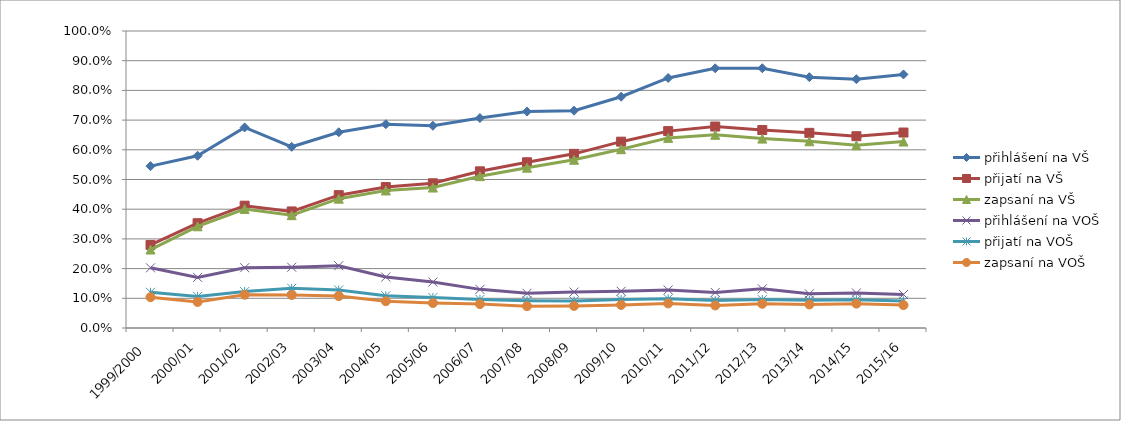
| Category | přihlášení na VŠ | přijatí na VŠ | zapsaní na VŠ | přihlášení na VOŠ | přijatí na VOŠ | zapsaní na VOŠ |
|---|---|---|---|---|---|---|
| 1999/2000 | 0.545 | 0.28 | 0.264 | 0.203 | 0.12 | 0.104 |
| 2000/01 | 0.58 | 0.353 | 0.342 | 0.17 | 0.106 | 0.088 |
| 2001/02 | 0.675 | 0.412 | 0.401 | 0.203 | 0.123 | 0.112 |
| 2002/03 | 0.61 | 0.392 | 0.38 | 0.205 | 0.134 | 0.111 |
| 2003/04 | 0.659 | 0.447 | 0.436 | 0.21 | 0.128 | 0.107 |
| 2004/05 | 0.686 | 0.475 | 0.463 | 0.172 | 0.108 | 0.09 |
| 2005/06 | 0.681 | 0.487 | 0.473 | 0.155 | 0.102 | 0.084 |
| 2006/07 | 0.707 | 0.527 | 0.511 | 0.13 | 0.096 | 0.08 |
| 2007/08 | 0.729 | 0.558 | 0.54 | 0.117 | 0.092 | 0.073 |
| 2008/09 | 0.732 | 0.586 | 0.567 | 0.121 | 0.091 | 0.074 |
| 2009/10 | 0.779 | 0.627 | 0.602 | 0.124 | 0.096 | 0.078 |
| 2010/11 | 0.842 | 0.663 | 0.64 | 0.128 | 0.099 | 0.083 |
| 2011/12 | 0.874 | 0.678 | 0.65 | 0.12 | 0.092 | 0.076 |
| 2012/13 | 0.875 | 0.667 | 0.638 | 0.132 | 0.096 | 0.082 |
| 2013/14 | 0.845 | 0.657 | 0.629 | 0.115 | 0.093 | 0.079 |
| 2014/15 | 0.838 | 0.646 | 0.615 | 0.118 | 0.095 | 0.082 |
| 2015/16 | 0.854 | 0.658 | 0.628 | 0.113 | 0.091 | 0.077 |